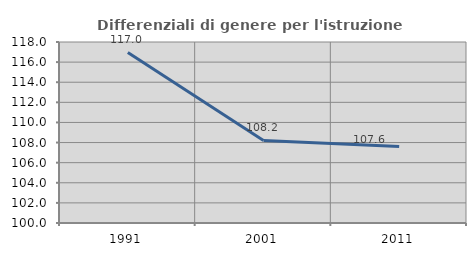
| Category | Differenziali di genere per l'istruzione superiore |
|---|---|
| 1991.0 | 116.957 |
| 2001.0 | 108.215 |
| 2011.0 | 107.607 |